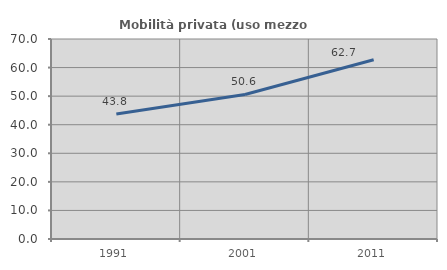
| Category | Mobilità privata (uso mezzo privato) |
|---|---|
| 1991.0 | 43.77 |
| 2001.0 | 50.592 |
| 2011.0 | 62.739 |